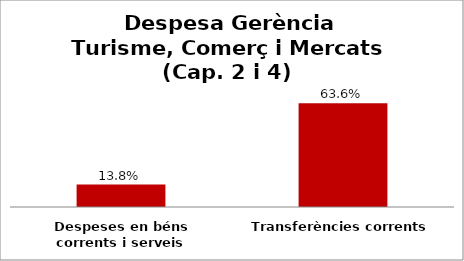
| Category | Series 0 |
|---|---|
| Despeses en béns corrents i serveis | 0.138 |
| Transferències corrents | 0.636 |